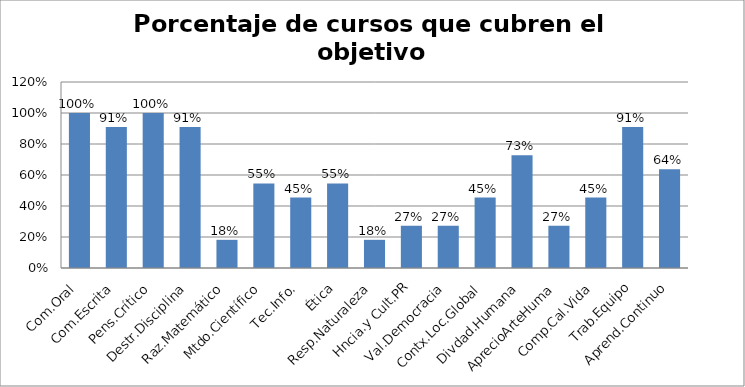
| Category | Series 0 |
|---|---|
| Com.Oral | 1 |
| Com.Escrita | 0.909 |
| Pens.Crítico | 1 |
| Destr.Disciplina | 0.909 |
| Raz.Matemático | 0.182 |
| Mtdo.Científico | 0.545 |
| Tec.Info. | 0.455 |
| Ética | 0.545 |
| Resp.Naturaleza | 0.182 |
| Hncia.y Cult.PR | 0.273 |
| Val.Democracia | 0.273 |
| Contx.Loc.Global | 0.455 |
| Divdad.Humana | 0.727 |
| AprecioArteHuma | 0.273 |
| Comp.Cal.Vida | 0.455 |
| Trab.Equipo | 0.909 |
| Aprend.Continuo | 0.636 |